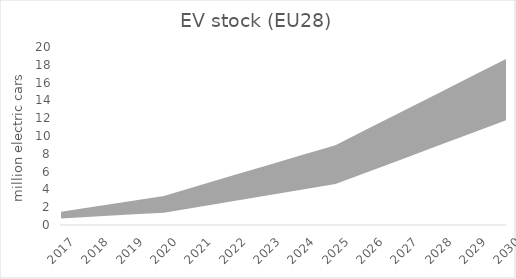
| Category | NPF scenario | Base scenario |
|---|---|---|
| 2017.0 | 1490890.597 | 740012.584 |
| 2018.0 | 2082973.496 | 956656.476 |
| 2019.0 | 2675056.395 | 1173300.367 |
| 2020.0 | 3267139.293 | 1389944.259 |
| 2021.0 | 4408045.614 | 2033151.815 |
| 2022.0 | 5548951.935 | 2676359.371 |
| 2023.0 | 6689858.255 | 3319566.926 |
| 2024.0 | 7830764.576 | 3962774.482 |
| 2025.0 | 8971670.897 | 4605982.038 |
| 2026.0 | 10918528.426 | 6045440.217 |
| 2027.0 | 12865385.956 | 7484898.395 |
| 2028.0 | 14812243.486 | 8924356.574 |
| 2029.0 | 16759028.777 | 10363814.753 |
| 2030.0 | 18705958.545 | 11803272.932 |